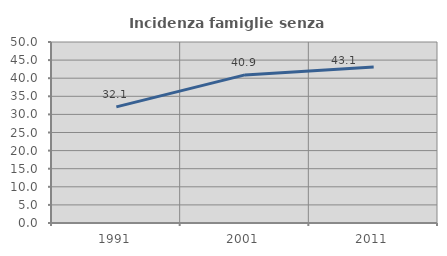
| Category | Incidenza famiglie senza nuclei |
|---|---|
| 1991.0 | 32.075 |
| 2001.0 | 40.909 |
| 2011.0 | 43.077 |